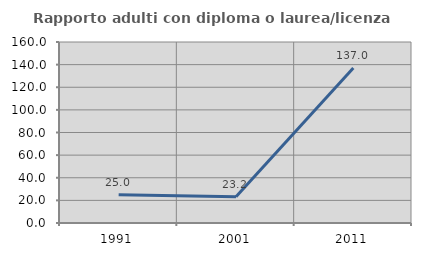
| Category | Rapporto adulti con diploma o laurea/licenza media  |
|---|---|
| 1991.0 | 25 |
| 2001.0 | 23.171 |
| 2011.0 | 137.037 |